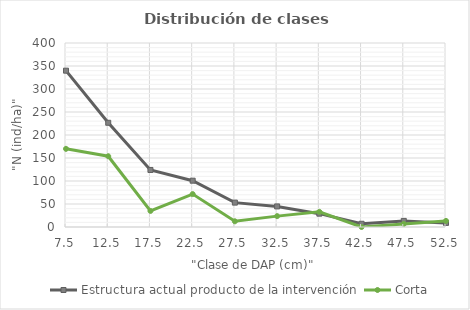
| Category | Estructura actual producto de la intervención | Corta  |
|---|---|---|
| 7.5 | 339.86 | 169.93 |
| 12.5 | 226.573 | 153.86 |
| 17.5 | 124 | 34.951 |
| 22.5 | 100.699 | 71.549 |
| 27.5 | 53 | 12.367 |
| 32.5 | 44.755 | 23.633 |
| 37.5 | 29 | 33 |
| 42.5 | 7 | 0 |
| 47.5 | 13.261 | 6.63 |
| 52.5 | 8.841 | 13.261 |